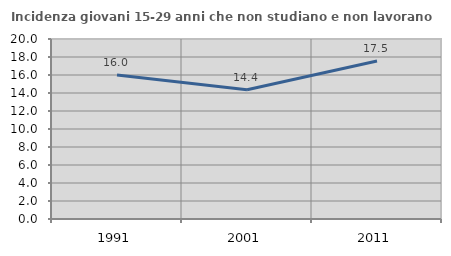
| Category | Incidenza giovani 15-29 anni che non studiano e non lavorano  |
|---|---|
| 1991.0 | 16 |
| 2001.0 | 14.37 |
| 2011.0 | 17.549 |